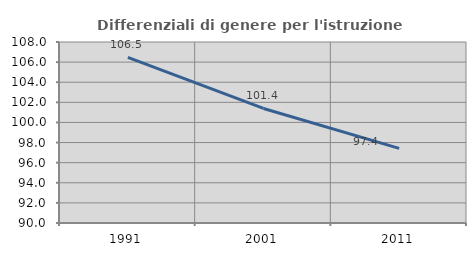
| Category | Differenziali di genere per l'istruzione superiore |
|---|---|
| 1991.0 | 106.477 |
| 2001.0 | 101.39 |
| 2011.0 | 97.426 |